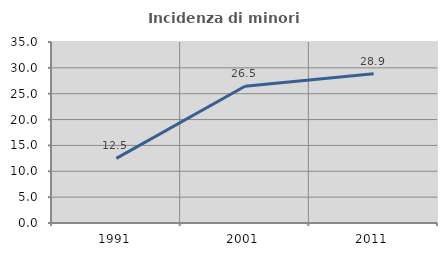
| Category | Incidenza di minori stranieri |
|---|---|
| 1991.0 | 12.5 |
| 2001.0 | 26.452 |
| 2011.0 | 28.859 |